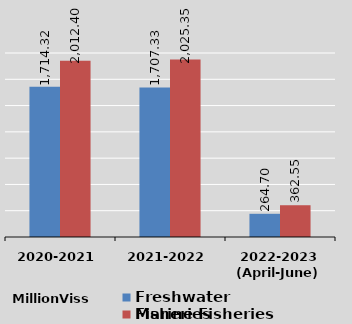
| Category | Freshwater Fisheries | Marine Fisheries |
|---|---|---|
| 2020-2021 | 1714.32 | 2012.4 |
| 2021-2022 | 1707.33 | 2025.35 |
| 2022-2023
(April-June) | 264.7 | 362.55 |